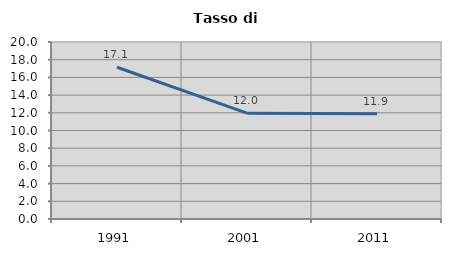
| Category | Tasso di disoccupazione   |
|---|---|
| 1991.0 | 17.147 |
| 2001.0 | 11.963 |
| 2011.0 | 11.881 |